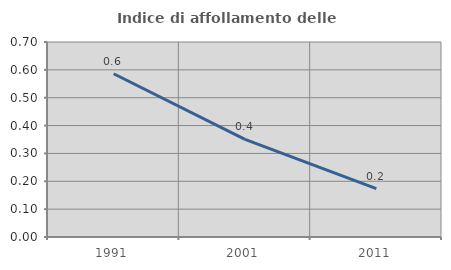
| Category | Indice di affollamento delle abitazioni  |
|---|---|
| 1991.0 | 0.586 |
| 2001.0 | 0.35 |
| 2011.0 | 0.174 |